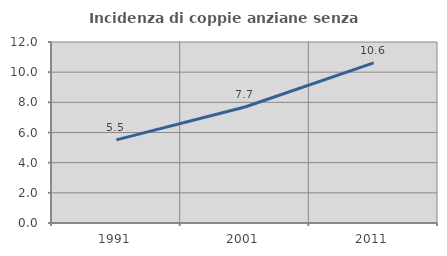
| Category | Incidenza di coppie anziane senza figli  |
|---|---|
| 1991.0 | 5.51 |
| 2001.0 | 7.692 |
| 2011.0 | 10.615 |